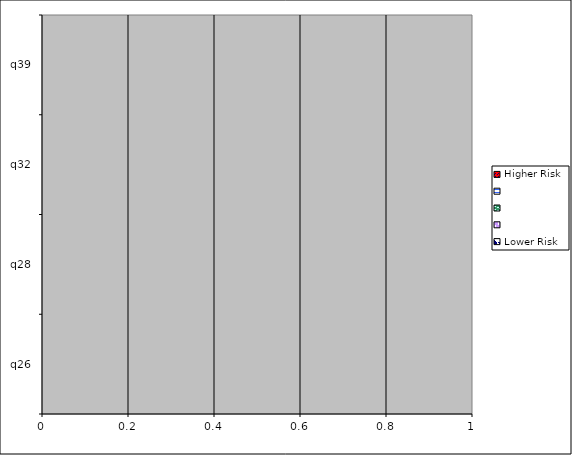
| Category | Higher Risk |   | Lower Risk |
|---|---|---|---|
| q26 | 0 | 0 | 0 |
| q28 | 0 | 0 | 0 |
| q32 | 0 | 0 | 0 |
| q39 | 0 | 0 | 0 |